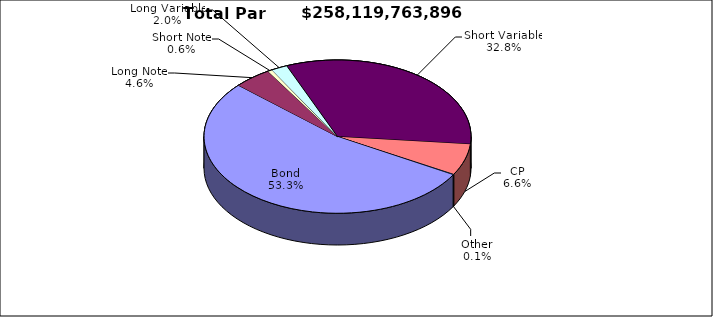
| Category | Par Value |
|---|---|
| Bond | 137698233470 |
| Long Note | 11847673229 |
| Short Note | 1420706586 |
| Long Variable | 5080699000 |
| Short Variable | 84645268611 |
| CP | 17085123000 |
| Other | 342060000 |